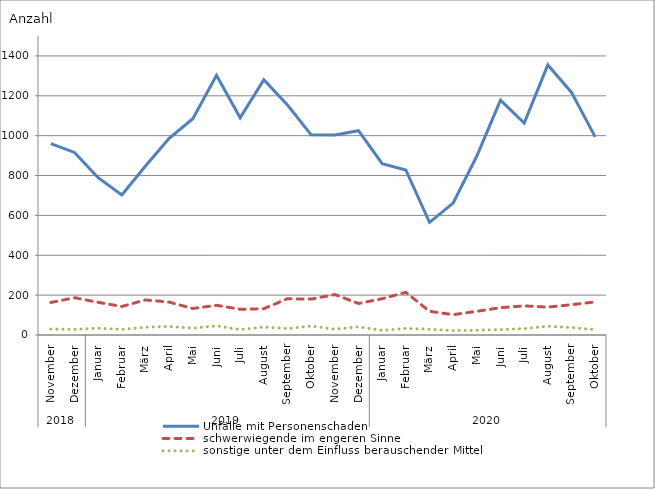
| Category | Unfälle mit Personenschaden | schwerwiegende im engeren Sinne | sonstige unter dem Einfluss berauschender Mittel |
|---|---|---|---|
| 0 | 960 | 163 | 30 |
| 1 | 916 | 187 | 28 |
| 2 | 789 | 164 | 34 |
| 3 | 702 | 143 | 28 |
| 4 | 848 | 176 | 39 |
| 5 | 987 | 165 | 43 |
| 6 | 1085 | 133 | 34 |
| 7 | 1303 | 149 | 46 |
| 8 | 1090 | 129 | 27 |
| 9 | 1281 | 132 | 40 |
| 10 | 1154 | 182 | 32 |
| 11 | 1004 | 180 | 45 |
| 12 | 1003 | 203 | 29 |
| 13 | 1025 | 158 | 41 |
| 14 | 860 | 182 | 23 |
| 15 | 828 | 214 | 33 |
| 16 | 565 | 119 | 29 |
| 17 | 662 | 102 | 22 |
| 18 | 898 | 119 | 24 |
| 19 | 1178 | 137 | 27 |
| 20 | 1063 | 146 | 32 |
| 21 | 1355 | 140 | 44 |
| 22 | 1217 | 152 | 37 |
| 23 | 994 | 166 | 27 |